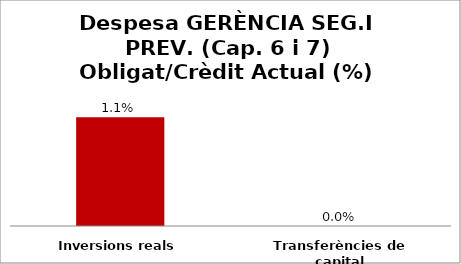
| Category | Series 0 |
|---|---|
| Inversions reals | 0.011 |
| Transferències de capital | 0 |